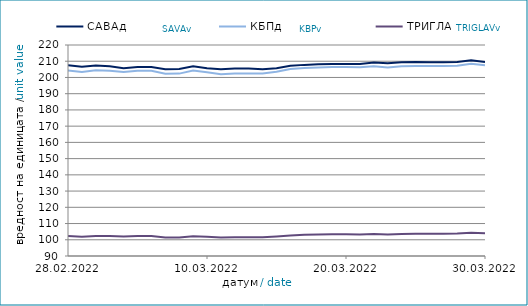
| Category | САВАд | КБПд | ТРИГЛАВд |
|---|---|---|---|
| 2022-02-28 | 207.467 | 204.311 | 102.358 |
| 2022-03-01 | 206.534 | 203.368 | 101.895 |
| 2022-03-02 | 207.412 | 204.366 | 102.351 |
| 2022-03-03 | 206.962 | 204.117 | 102.323 |
| 2022-03-04 | 205.721 | 203.394 | 101.973 |
| 2022-03-05 | 206.379 | 204.143 | 102.327 |
| 2022-03-06 | 206.384 | 204.149 | 102.329 |
| 2022-03-07 | 205.032 | 202.355 | 101.468 |
| 2022-03-08 | 205.164 | 202.368 | 101.399 |
| 2022-03-09 | 206.956 | 204.213 | 102.195 |
| 2022-03-10 | 205.701 | 203.168 | 101.913 |
| 2022-03-11 | 205.099 | 202.034 | 101.344 |
| 2022-03-12 | 205.499 | 202.506 | 101.563 |
| 2022-03-13 | 205.504 | 202.513 | 101.565 |
| 2022-03-14 | 205.112 | 202.418 | 101.509 |
| 2022-03-15 | 205.717 | 203.547 | 102.038 |
| 2022-03-16 | 207.156 | 205.184 | 102.673 |
| 2022-03-17 | 207.754 | 205.774 | 103.049 |
| 2022-03-18 | 208.151 | 206.208 | 103.222 |
| 2022-03-19 | 208.36 | 206.444 | 103.329 |
| 2022-03-20 | 208.365 | 206.451 | 103.331 |
| 2022-03-21 | 208.276 | 206.23 | 103.322 |
| 2022-03-22 | 209.172 | 206.93 | 103.545 |
| 2022-03-23 | 208.729 | 206.181 | 103.259 |
| 2022-03-24 | 209.406 | 206.937 | 103.625 |
| 2022-03-25 | 209.528 | 207.138 | 103.779 |
| 2022-03-26 | 209.43 | 207.015 | 103.721 |
| 2022-03-27 | 209.435 | 207.022 | 103.723 |
| 2022-03-28 | 209.466 | 207.272 | 103.834 |
| 2022-03-29 | 210.53 | 208.464 | 104.353 |
| 2022-03-30 | 209.585 | 207.467 | 103.964 |